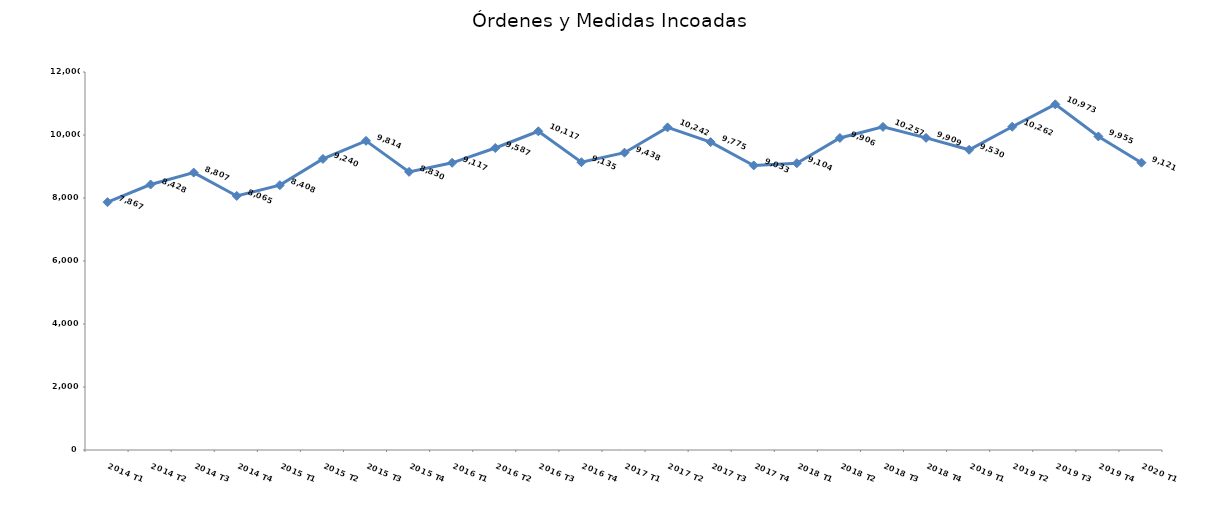
| Category | Series 0 |
|---|---|
| 2014 T1 | 7867 |
| 2014 T2 | 8428 |
| 2014 T3 | 8807 |
| 2014 T4 | 8065 |
| 2015 T1 | 8408 |
| 2015 T2 | 9240 |
| 2015 T3 | 9814 |
| 2015 T4 | 8830 |
| 2016 T1 | 9117 |
| 2016 T2 | 9587 |
| 2016 T3 | 10117 |
| 2016 T4 | 9135 |
| 2017 T1 | 9438 |
| 2017 T2 | 10242 |
| 2017 T3 | 9775 |
| 2017 T4 | 9033 |
| 2018 T1 | 9104 |
| 2018 T2 | 9906 |
| 2018 T3 | 10257 |
| 2018 T4 | 9909 |
| 2019 T1 | 9530 |
| 2019 T2 | 10262 |
| 2019 T3 | 10973 |
| 2019 T4 | 9955 |
| 2020 T1 | 9121 |